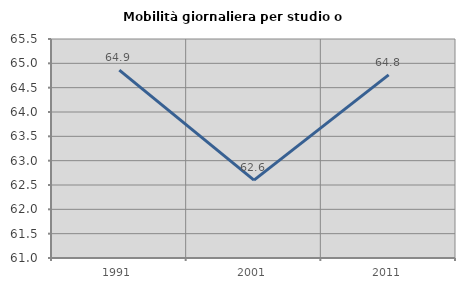
| Category | Mobilità giornaliera per studio o lavoro |
|---|---|
| 1991.0 | 64.862 |
| 2001.0 | 62.601 |
| 2011.0 | 64.763 |